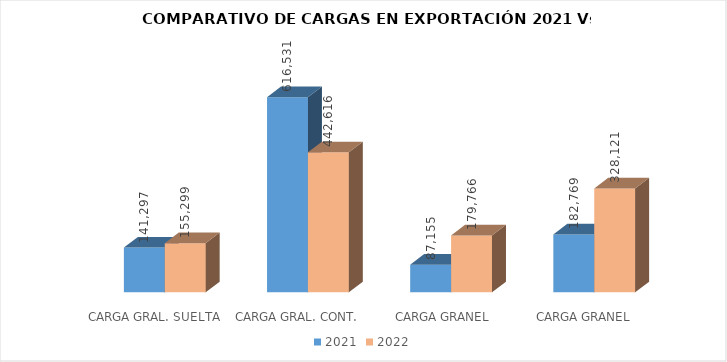
| Category | 2021 | 2022 |
|---|---|---|
|  CARGA GRAL. SUELTA | 141297 | 155299 |
|  CARGA GRAL. CONT. | 616531 | 442616 |
|  CARGA GRANEL SOLIDA | 87155 | 179766 |
| CARGA GRANEL LÍQUIDA | 182769 | 328121 |